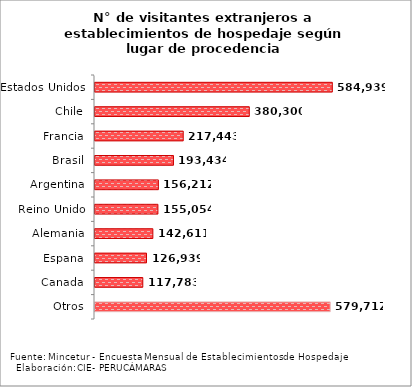
| Category | Series 0 |
|---|---|
| Estados Unidos | 584939 |
| Chile | 380300 |
| Francia | 217443 |
| Brasil | 193434 |
| Argentina | 156212 |
| Reino Unido | 155054 |
| Alemania | 142611 |
| Espana | 126939 |
| Canada | 117783 |
| Otros | 579712 |